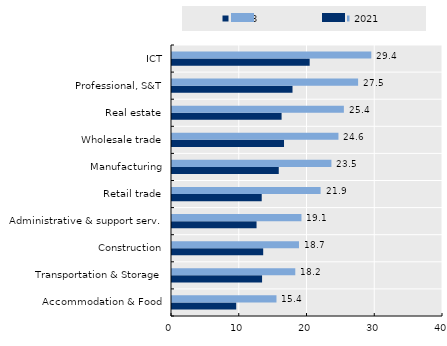
| Category | 2018 | 2021 |
|---|---|---|
| Accommodation & Food | 9.48 | 15.421 |
| Transportation & Storage | 13.295 | 18.197 |
| Construction | 13.461 | 18.744 |
| Administrative & support serv. | 12.479 | 19.108 |
| Retail trade | 13.243 | 21.932 |
| Manufacturing | 15.758 | 23.531 |
| Wholesale trade | 16.534 | 24.568 |
| Real estate | 16.175 | 25.369 |
| Professional, S&T | 17.788 | 27.469 |
| ICT | 20.319 | 29.418 |